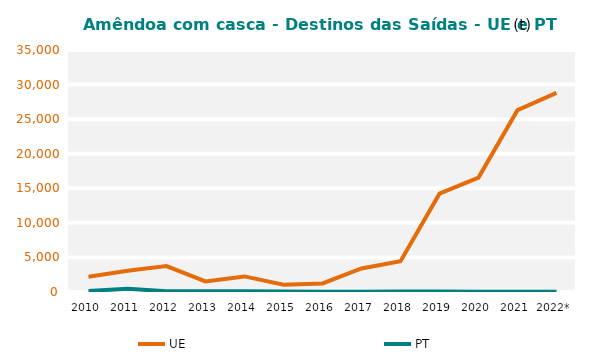
| Category | UE | PT |
|---|---|---|
| 2010 | 2209.086 | 147.797 |
| 2011 | 3061.426 | 470.85 |
| 2012 | 3742.967 | 107.39 |
| 2013 | 1521.463 | 123.085 |
| 2014 | 2254.117 | 112.442 |
| 2015 | 1039.819 | 64.78 |
| 2016 | 1235.189 | 41.37 |
| 2017 | 3400.637 | 36.951 |
| 2018 | 4442.862 | 57.057 |
| 2019 | 14221.116 | 66.121 |
| 2020 | 16543.428 | 26.719 |
| 2021 | 26295.026 | 42.61 |
| 2022* | 28791.97 | 43.92 |